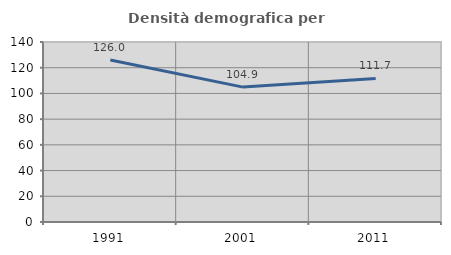
| Category | Densità demografica |
|---|---|
| 1991.0 | 125.972 |
| 2001.0 | 104.918 |
| 2011.0 | 111.698 |